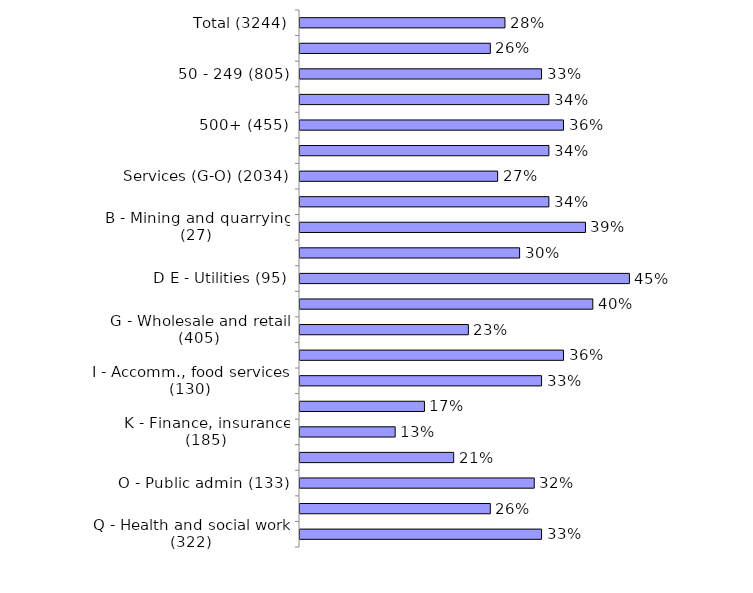
| Category | Series 0 |
|---|---|
| Total (3244) | 0.28 |
| 10-49 (1658) | 0.26 |
| 50 - 249 (805) | 0.33 |
| 250 - 499 (326) | 0.34 |
| 500+ (455) | 0.36 |
| Production (A-F) (1210) | 0.34 |
| Services (G-O) (2034) | 0.27 |
| A - Agriculture (96) | 0.34 |
| B - Mining and quarrying (27) | 0.39 |
| C - Manufacturing (866) | 0.3 |
| D E - Utilities (95) | 0.45 |
| F - Construction (126) | 0.4 |
| G - Wholesale and retail (405) | 0.23 |
| H - Transport , storage (148) | 0.36 |
| I - Accomm., food services (130) | 0.33 |
| J - Information, comms (110) | 0.17 |
| K - Finance, insurance (185) | 0.13 |
| LMNRS - Bus/tech/admin/arts/other (272) | 0.21 |
| O - Public admin (133) | 0.32 |
| P - Education (329) | 0.26 |
| Q - Health and social work (322) | 0.33 |